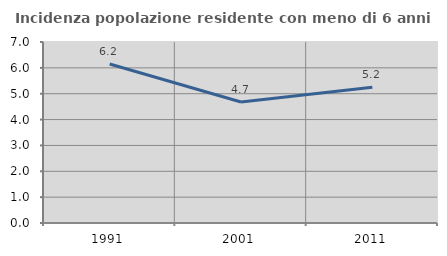
| Category | Incidenza popolazione residente con meno di 6 anni |
|---|---|
| 1991.0 | 6.151 |
| 2001.0 | 4.678 |
| 2011.0 | 5.248 |